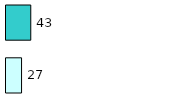
| Category | Series 0 | Series 1 |
|---|---|---|
| 0 | 27 | 43 |